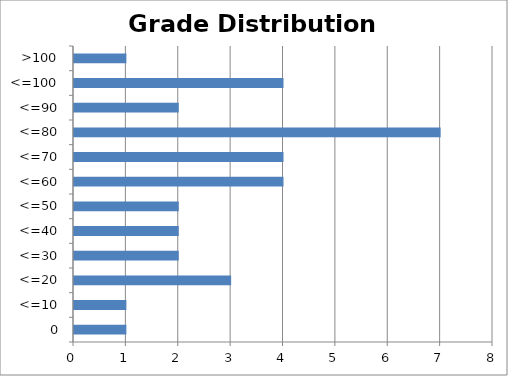
| Category | Grade Distribution |
|---|---|
| 0 | 1 |
| <=10 | 1 |
| <=20 | 3 |
| <=30 | 2 |
| <=40 | 2 |
| <=50 | 2 |
| <=60 | 4 |
| <=70 | 4 |
| <=80 | 7 |
| <=90 | 2 |
| <=100 | 4 |
| >100 | 1 |